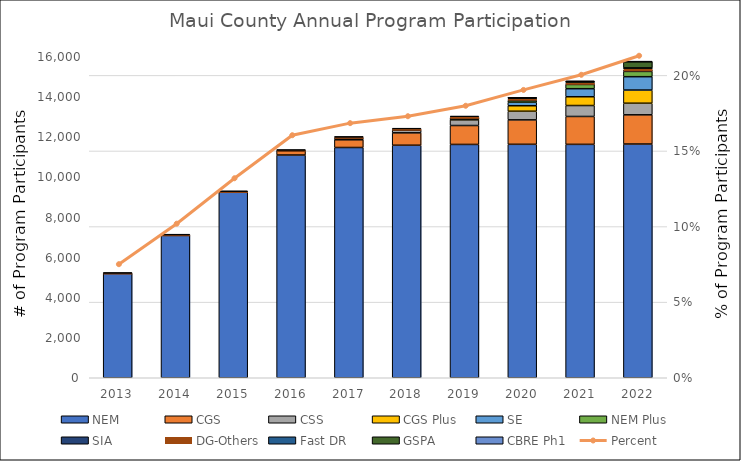
| Category | NEM | CGS | CSS | CGS Plus | SE | NEM Plus | SIA | DG-Others | Fast DR | GSPA | CBRE Ph1 |
|---|---|---|---|---|---|---|---|---|---|---|---|
| 2013.0 | 5198 | 0 | 0 | 0 | 0 | 0 | 13 | 13 | 3 | 0 | 0 |
| 2014.0 | 7098 | 0 | 0 | 0 | 0 | 0 | 17 | 17 | 4 | 0 | 0 |
| 2015.0 | 9256 | 0 | 0 | 0 | 0 | 0 | 20 | 20 | 4 | 0 | 0 |
| 2016.0 | 11103 | 195 | 2 | 0 | 0 | 0 | 27 | 27 | 4 | 0 | 0 |
| 2017.0 | 11478 | 384 | 77 | 0 | 0 | 0 | 34 | 34 | 3 | 0 | 0 |
| 2018.0 | 11591 | 618 | 131 | 0 | 0 | 0 | 38 | 38 | 12 | 0 | 0 |
| 2019.0 | 11631 | 943 | 283 | 47 | 2 | 17 | 46 | 46 | 29 | 0 | 0 |
| 2020.0 | 11637 | 1218 | 430 | 274 | 179 | 89 | 47 | 47 | 29 | 2 | 1 |
| 2021.0 | 11635 | 1390 | 545 | 438 | 401 | 212 | 46 | 46 | 29 | 38 | 1 |
| 2022.0 | 11651 | 1456 | 578 | 656 | 667 | 263 | 66 | 66 | 43 | 312 | 1 |